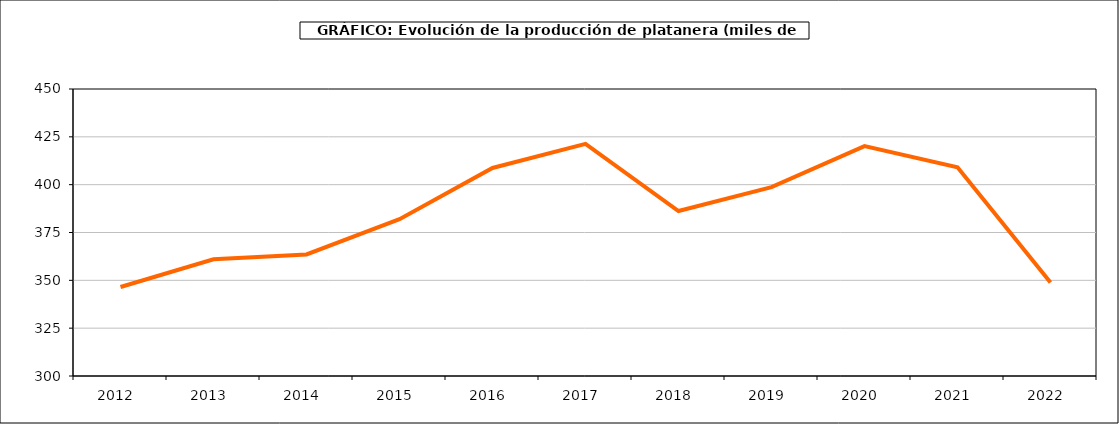
| Category | producción platanera |
|---|---|
| 2012.0 | 346.509 |
| 2013.0 | 360.987 |
| 2014.0 | 363.552 |
| 2015.0 | 381.983 |
| 2016.0 | 408.716 |
| 2017.0 | 421.313 |
| 2018.0 | 386.226 |
| 2019.0 | 398.722 |
| 2020.0 | 420.144 |
| 2021.0 | 409.106 |
| 2022.0 | 348.874 |